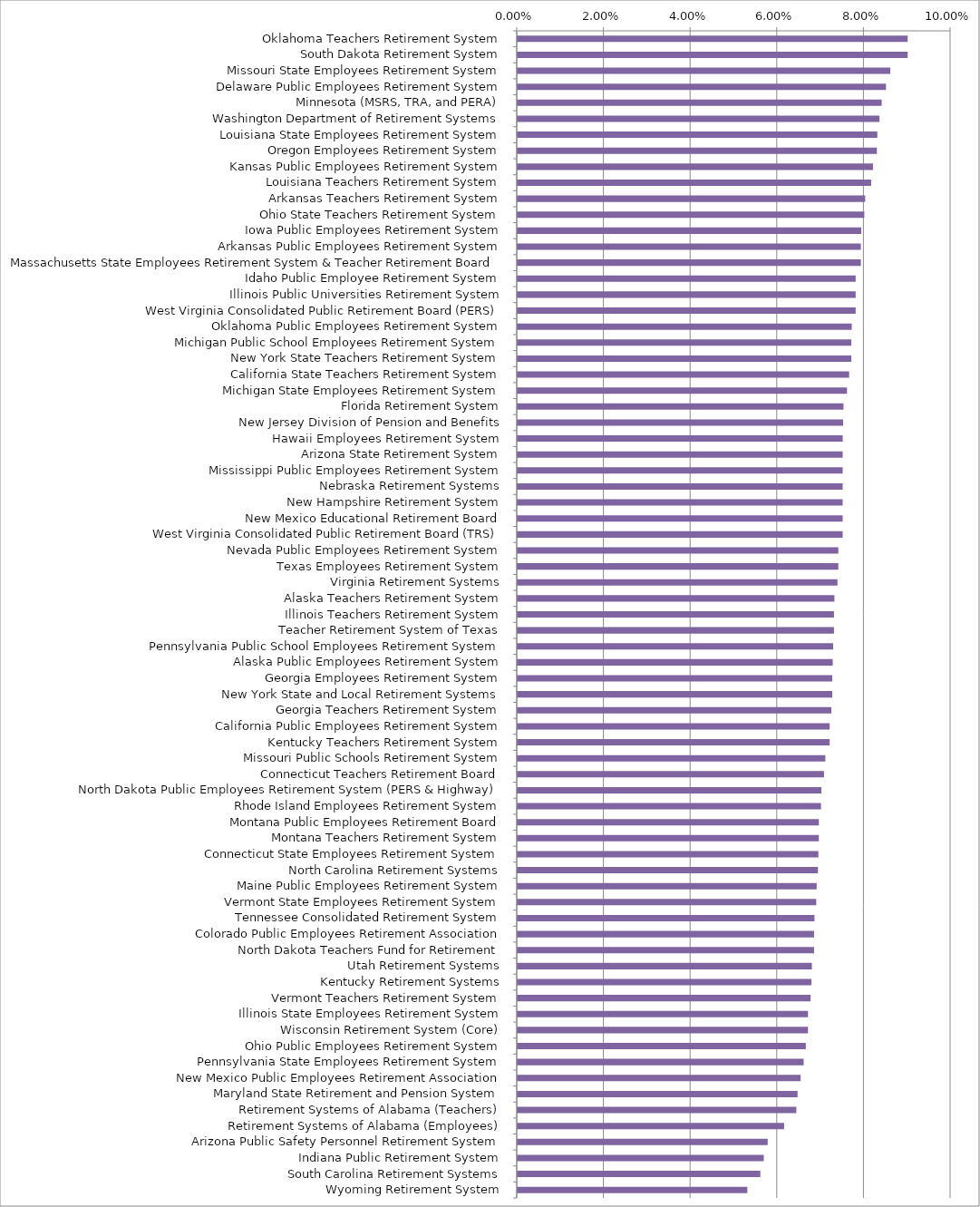
| Category | Series 0 | Series 1 | Series 2 | Series 3 |
|---|---|---|---|---|
| Oklahoma Teachers Retirement System |  |  |  | 0.09 |
| South Dakota Retirement System |  |  |  | 0.09 |
| Missouri State Employees Retirement System |  |  |  | 0.086 |
| Delaware Public Employees Retirement System |  |  |  | 0.085 |
| Minnesota (MSRS, TRA, and PERA) |  |  |  | 0.084 |
| Washington Department of Retirement Systems |  |  |  | 0.084 |
| Louisiana State Employees Retirement System |  |  |  | 0.083 |
| Oregon Employees Retirement System |  |  |  | 0.083 |
| Kansas Public Employees Retirement System |  |  |  | 0.082 |
| Louisiana Teachers Retirement System |  |  |  | 0.082 |
| Arkansas Teachers Retirement System |  |  |  | 0.08 |
| Ohio State Teachers Retirement System |  |  |  | 0.08 |
| Iowa Public Employees Retirement System |  |  |  | 0.079 |
| Arkansas Public Employees Retirement System |  |  |  | 0.079 |
| Massachusetts State Employees Retirement System & Teacher Retirement Board |  |  |  | 0.079 |
| Idaho Public Employee Retirement System |  |  |  | 0.078 |
| Illinois Public Universities Retirement System |  |  |  | 0.078 |
| West Virginia Consolidated Public Retirement Board (PERS) |  |  |  | 0.078 |
| Oklahoma Public Employees Retirement System |  |  |  | 0.077 |
| Michigan Public School Employees Retirement System |  |  |  | 0.077 |
| New York State Teachers Retirement System |  |  |  | 0.077 |
| California State Teachers Retirement System |  |  |  | 0.076 |
| Michigan State Employees Retirement System |  |  |  | 0.076 |
| Florida Retirement System |  |  |  | 0.075 |
| New Jersey Division of Pension and Benefits |  |  |  | 0.075 |
| Hawaii Employees Retirement System |  |  |  | 0.075 |
| Arizona State Retirement System |  |  |  | 0.075 |
| Mississippi Public Employees Retirement System |  |  |  | 0.075 |
| Nebraska Retirement Systems |  |  |  | 0.075 |
| New Hampshire Retirement System |  |  |  | 0.075 |
| New Mexico Educational Retirement Board |  |  |  | 0.075 |
| West Virginia Consolidated Public Retirement Board (TRS) |  |  |  | 0.075 |
| Nevada Public Employees Retirement System |  |  |  | 0.074 |
| Texas Employees Retirement System |  |  |  | 0.074 |
| Virginia Retirement Systems |  |  |  | 0.074 |
| Alaska Teachers Retirement System |  |  |  | 0.073 |
| Illinois Teachers Retirement System |  |  |  | 0.073 |
| Teacher Retirement System of Texas |  |  |  | 0.073 |
| Pennsylvania Public School Employees Retirement System |  |  |  | 0.073 |
| Alaska Public Employees Retirement System |  |  |  | 0.073 |
| Georgia Employees Retirement System |  |  |  | 0.073 |
| New York State and Local Retirement Systems |  |  |  | 0.073 |
| Georgia Teachers Retirement System |  |  |  | 0.072 |
| California Public Employees Retirement System |  |  |  | 0.072 |
| Kentucky Teachers Retirement System |  |  |  | 0.072 |
| Missouri Public Schools Retirement System |  |  |  | 0.071 |
| Connecticut Teachers Retirement Board |  |  |  | 0.071 |
| North Dakota Public Employees Retirement System (PERS & Highway) |  |  |  | 0.07 |
| Rhode Island Employees Retirement System |  |  |  | 0.07 |
| Montana Public Employees Retirement Board |  |  |  | 0.07 |
| Montana Teachers Retirement System |  |  |  | 0.07 |
| Connecticut State Employees Retirement System |  |  |  | 0.069 |
| North Carolina Retirement Systems |  |  |  | 0.069 |
| Maine Public Employees Retirement System |  |  |  | 0.069 |
| Vermont State Employees Retirement System |  |  |  | 0.069 |
| Tennessee Consolidated Retirement System |  |  |  | 0.069 |
| Colorado Public Employees Retirement Association |  |  |  | 0.068 |
| North Dakota Teachers Fund for Retirement |  |  |  | 0.068 |
| Utah Retirement Systems |  |  |  | 0.068 |
| Kentucky Retirement Systems |  |  |  | 0.068 |
| Vermont Teachers Retirement System |  |  |  | 0.068 |
| Illinois State Employees Retirement System |  |  |  | 0.067 |
| Wisconsin Retirement System (Core) |  |  |  | 0.067 |
| Ohio Public Employees Retirement System |  |  |  | 0.067 |
| Pennsylvania State Employees Retirement System |  |  |  | 0.066 |
| New Mexico Public Employees Retirement Association |  |  |  | 0.065 |
| Maryland State Retirement and Pension System |  |  |  | 0.065 |
| Retirement Systems of Alabama (Teachers) |  |  |  | 0.064 |
| Retirement Systems of Alabama (Employees) |  |  |  | 0.061 |
| Arizona Public Safety Personnel Retirement System |  |  |  | 0.058 |
| Indiana Public Retirement System |  |  |  | 0.057 |
| South Carolina Retirement Systems |  |  |  | 0.056 |
| Wyoming Retirement System |  |  |  | 0.053 |